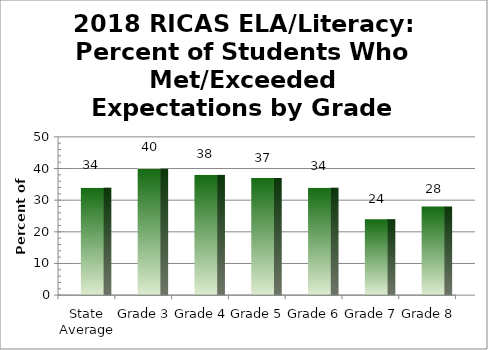
| Category | Levels 3 & 4 |
|---|---|
| State Average | 34 |
| Grade 3 | 40 |
| Grade 4 | 38 |
| Grade 5 | 37 |
| Grade 6 | 34 |
| Grade 7 | 24 |
| Grade 8 | 28 |